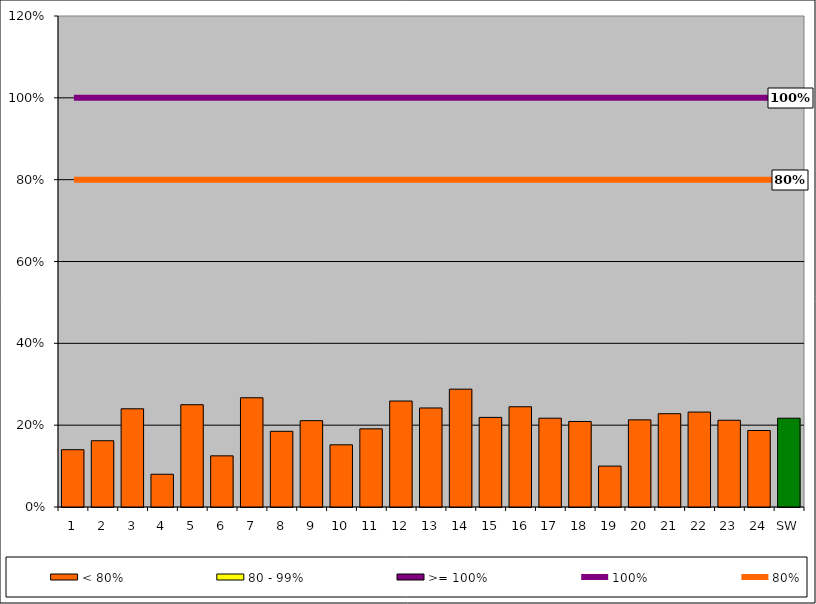
| Category | < 80% | 80 - 99% | >= 100% |
|---|---|---|---|
| 1 | 0.14 | 0 | 0 |
| 2 | 0.162 | 0 | 0 |
| 3 | 0.24 | 0 | 0 |
| 4 | 0.08 | 0 | 0 |
| 5 | 0.25 | 0 | 0 |
| 6 | 0.125 | 0 | 0 |
| 7 | 0.267 | 0 | 0 |
| 8 | 0.185 | 0 | 0 |
| 9 | 0.211 | 0 | 0 |
| 10 | 0.152 | 0 | 0 |
| 11 | 0.191 | 0 | 0 |
| 12 | 0.259 | 0 | 0 |
| 13 | 0.242 | 0 | 0 |
| 14 | 0.288 | 0 | 0 |
| 15 | 0.219 | 0 | 0 |
| 16 | 0.245 | 0 | 0 |
| 17 | 0.217 | 0 | 0 |
| 18 | 0.209 | 0 | 0 |
| 19 | 0.1 | 0 | 0 |
| 20 | 0.213 | 0 | 0 |
| 21 | 0.228 | 0 | 0 |
| 22 | 0.232 | 0 | 0 |
| 23 | 0.212 | 0 | 0 |
| 24 | 0.187 | 0 | 0 |
| SW | 0.217 | 0 | 0 |